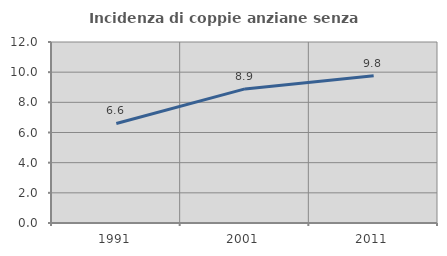
| Category | Incidenza di coppie anziane senza figli  |
|---|---|
| 1991.0 | 6.601 |
| 2001.0 | 8.889 |
| 2011.0 | 9.759 |